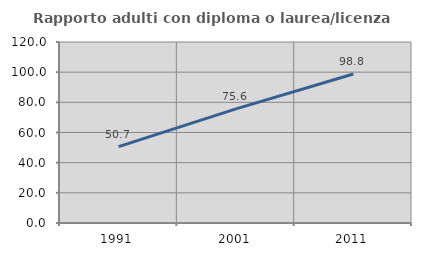
| Category | Rapporto adulti con diploma o laurea/licenza media  |
|---|---|
| 1991.0 | 50.654 |
| 2001.0 | 75.624 |
| 2011.0 | 98.793 |